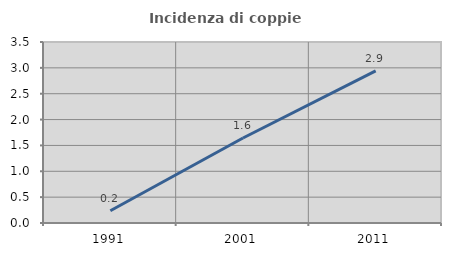
| Category | Incidenza di coppie miste |
|---|---|
| 1991.0 | 0.236 |
| 2001.0 | 1.643 |
| 2011.0 | 2.941 |